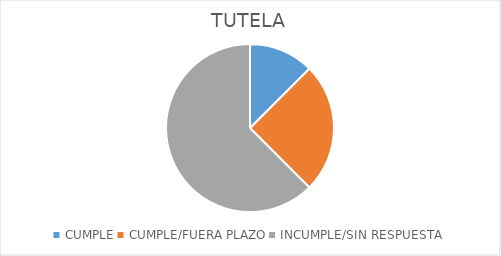
| Category | Series 0 |
|---|---|
| CUMPLE | 1 |
| CUMPLE/FUERA PLAZO | 2 |
| INCUMPLE/SIN RESPUESTA | 5 |